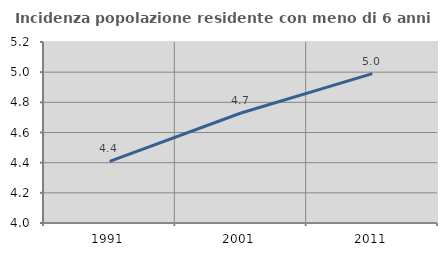
| Category | Incidenza popolazione residente con meno di 6 anni |
|---|---|
| 1991.0 | 4.409 |
| 2001.0 | 4.729 |
| 2011.0 | 4.99 |